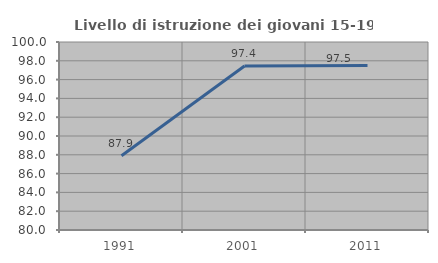
| Category | Livello di istruzione dei giovani 15-19 anni |
|---|---|
| 1991.0 | 87.895 |
| 2001.0 | 97.448 |
| 2011.0 | 97.503 |